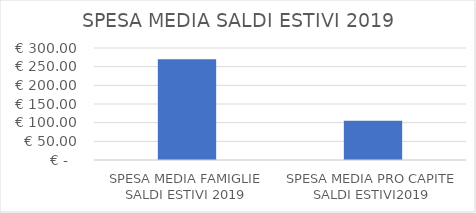
| Category | Series 0 |
|---|---|
| SPESA MEDIA FAMIGLIE SALDI ESTIVI 2019 | 270 |
| SPESA MEDIA PRO CAPITE SALDI ESTIVI2019 | 105 |